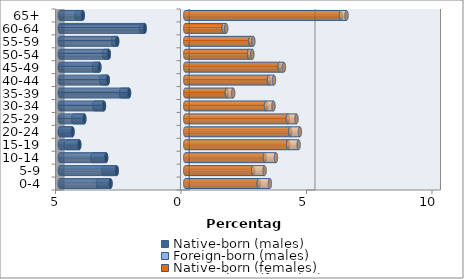
| Category | Native-born (males) | Foreign-born (males) | Native-born (females) | Foreign-born (females) |
|---|---|---|---|---|
| 0-4 | -2.979 | -0.499 | 2.929 | 0.442 |
| 5-9 | -2.732 | -0.532 | 2.708 | 0.451 |
| 10-14 | -3.153 | -0.544 | 3.172 | 0.442 |
| 15-19 | -4.222 | -0.528 | 4.101 | 0.415 |
| 20-24 | -4.493 | -0.497 | 4.185 | 0.383 |
| 25-29 | -4.022 | -0.44 | 4.086 | 0.346 |
| 30-34 | -3.24 | -0.382 | 3.217 | 0.299 |
| 35-39 | -2.242 | -0.318 | 1.66 | 0.25 |
| 40-44 | -3.087 | -0.258 | 3.333 | 0.201 |
| 45-49 | -3.422 | -0.219 | 3.764 | 0.167 |
| 50-54 | -3.047 | -0.181 | 2.543 | 0.131 |
| 55-59 | -2.712 | -0.161 | 2.596 | 0.117 |
| 60-64 | -1.618 | -0.144 | 1.532 | 0.1 |
| 65+ | -4.085 | -0.247 | 6.205 | 0.221 |